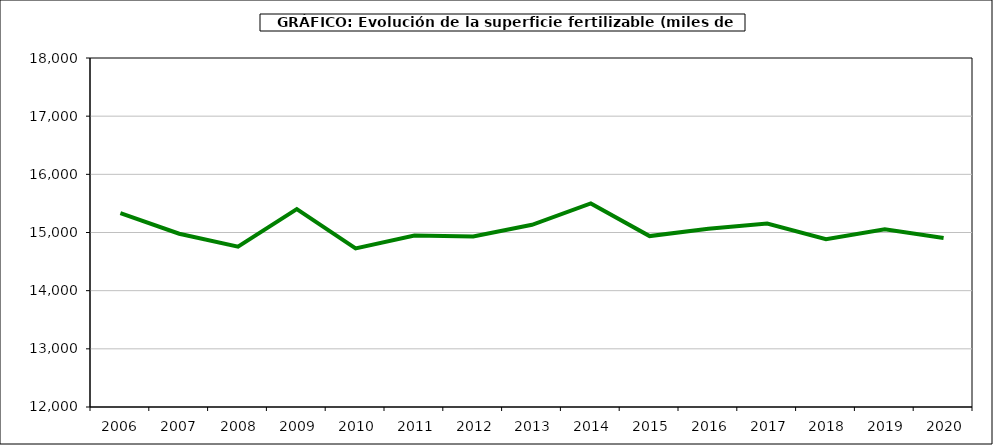
| Category | fertilizantes |
|---|---|
|   2006  | 15331.413 |
|   2007  | 14979.076 |
|   2008 | 14757 |
|   2009 | 15402 |
|   2010 | 14727 |
|   2011 | 14947 |
|   2012 | 14932 |
|   2013 | 15133 |
|   2014 | 15499 |
|   2015 | 14938 |
|   2016 | 15065 |
|   2017 | 15153 |
|   2018 | 14883 |
|   2019 | 15055 |
|   2020 | 14906 |